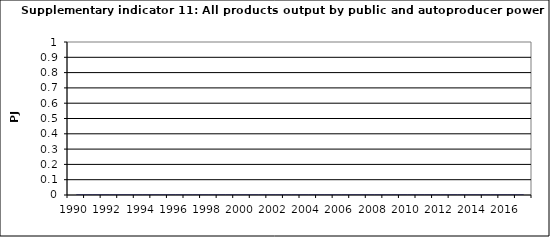
| Category | All products output by public and autoproducer power stations, PJ |
|---|---|
| 1990 | 0 |
| 1991 | 0 |
| 1992 | 0 |
| 1993 | 0 |
| 1994 | 0 |
| 1995 | 0 |
| 1996 | 0 |
| 1997 | 0 |
| 1998 | 0 |
| 1999 | 0 |
| 2000 | 0 |
| 2001 | 0 |
| 2002 | 0 |
| 2003 | 0 |
| 2004 | 0 |
| 2005 | 0 |
| 2006 | 0 |
| 2007 | 0 |
| 2008 | 0 |
| 2009 | 0 |
| 2010 | 0 |
| 2011 | 0 |
| 2012 | 0 |
| 2013 | 0 |
| 2014 | 0 |
| 2015 | 0 |
| 2016 | 0 |
| 2017 | 0 |